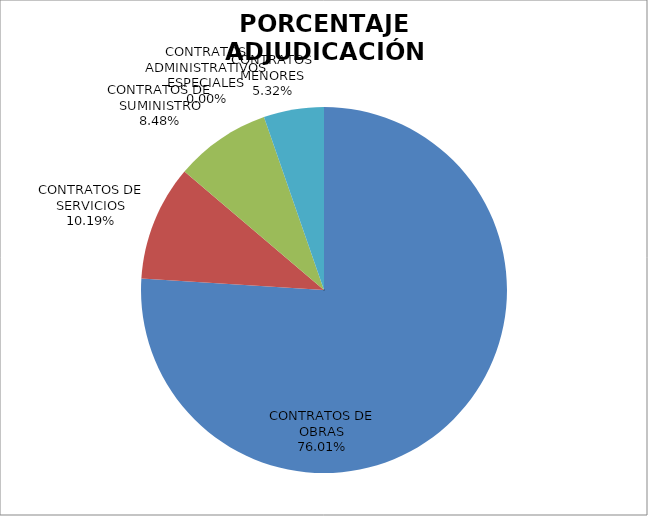
| Category | PORCENTAJE ADJUDICACIÓN CONTRATOS 2017 |
|---|---|
| CONTRATOS DE OBRAS | 76.01 |
| CONTRATOS DE SERVICIOS | 10.19 |
| CONTRATOS DE SUMINISTRO | 8.481 |
| CONTRATOS ADMINISTRATIVOS ESPECIALES | 0 |
| CONTRATOS MENORES | 5.319 |